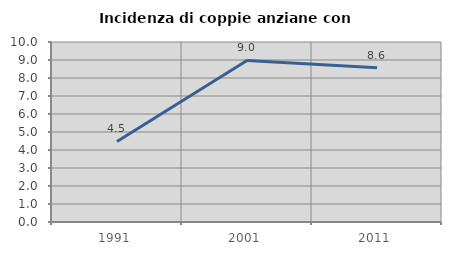
| Category | Incidenza di coppie anziane con figli |
|---|---|
| 1991.0 | 4.478 |
| 2001.0 | 8.974 |
| 2011.0 | 8.571 |